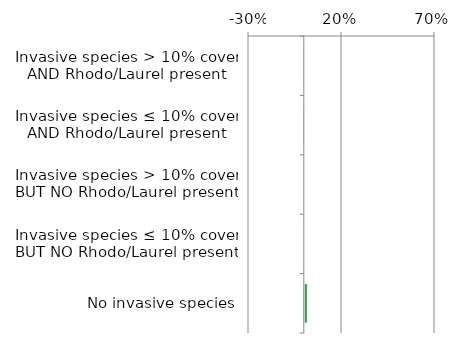
| Category | Near native & fragments |
|---|---|
| No invasive species | 0.019 |
| Invasive species ≤ 10% cover BUT NO Rhodo/Laurel present | 0 |
| Invasive species > 10% cover BUT NO Rhodo/Laurel present | 0 |
| Invasive species ≤ 10% cover AND Rhodo/Laurel present | 0.002 |
| Invasive species > 10% cover AND Rhodo/Laurel present | 0.001 |